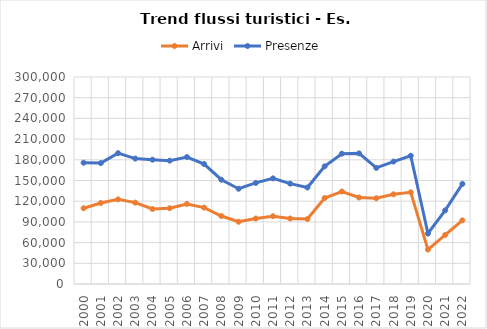
| Category | Arrivi | Presenze |
|---|---|---|
| 2000.0 | 109757 | 175749 |
| 2001.0 | 117392 | 175228 |
| 2002.0 | 122676 | 189602 |
| 2003.0 | 117949 | 181769 |
| 2004.0 | 108678 | 180186 |
| 2005.0 | 109867 | 178734 |
| 2006.0 | 116050 | 184014 |
| 2007.0 | 110718 | 173830 |
| 2008.0 | 98525 | 151152 |
| 2009.0 | 90211 | 138048 |
| 2010.0 | 94869 | 146496 |
| 2011.0 | 98235 | 153088 |
| 2012.0 | 94854 | 145452 |
| 2013.0 | 94227 | 139791 |
| 2014.0 | 124633 | 170518 |
| 2015.0 | 134023 | 188835 |
| 2016.0 | 125368 | 189301 |
| 2017.0 | 124252 | 168319 |
| 2018.0 | 130006 | 177432 |
| 2019.0 | 132931 | 185825 |
| 2020.0 | 49898 | 73213 |
| 2021.0 | 71170 | 106689 |
| 2022.0 | 92237 | 145085 |